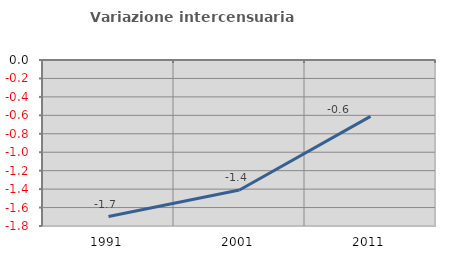
| Category | Variazione intercensuaria annua |
|---|---|
| 1991.0 | -1.698 |
| 2001.0 | -1.409 |
| 2011.0 | -0.611 |